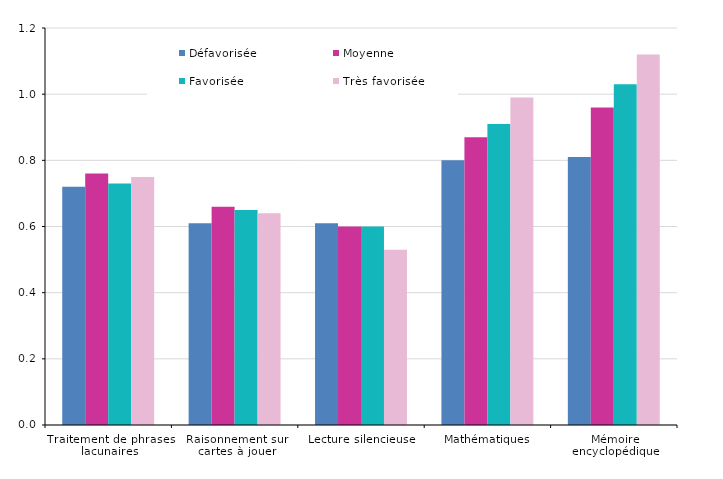
| Category | Défavorisée | Moyenne  | Favorisée | Très favorisée |
|---|---|---|---|---|
| Traitement de phrases lacunaires | 0.72 | 0.76 | 0.73 | 0.75 |
| Raisonnement sur cartes à jouer | 0.61 | 0.66 | 0.65 | 0.64 |
| Lecture silencieuse | 0.61 | 0.6 | 0.6 | 0.53 |
| Mathématiques | 0.8 | 0.87 | 0.91 | 0.99 |
| Mémoire encyclopédique | 0.81 | 0.96 | 1.03 | 1.12 |